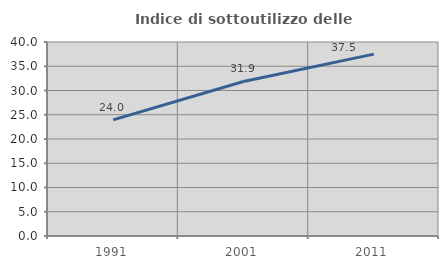
| Category | Indice di sottoutilizzo delle abitazioni  |
|---|---|
| 1991.0 | 23.953 |
| 2001.0 | 31.859 |
| 2011.0 | 37.501 |